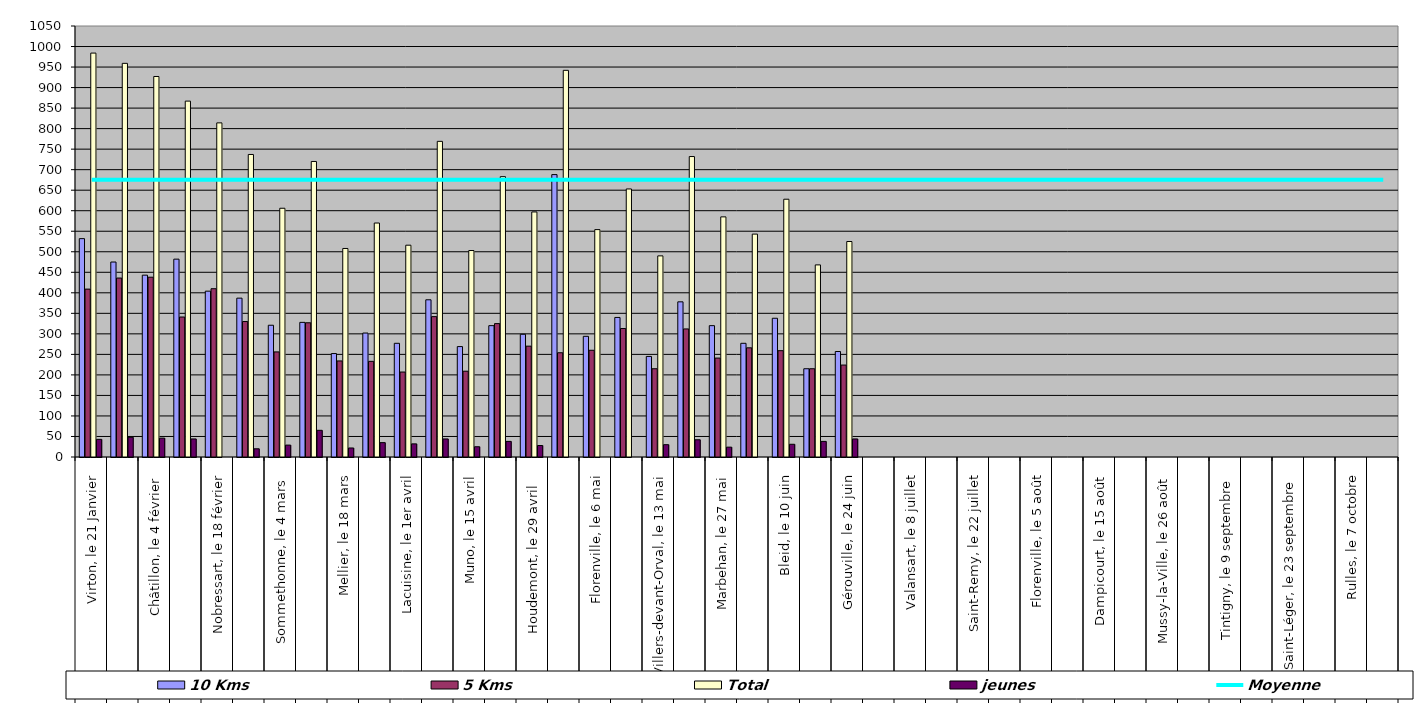
| Category | 10 Kms | 5 Kms | Total | jeunes |
|---|---|---|---|---|
| 0 | 532 | 409 | 984 | 43 |
| 1 | 475 | 436 | 959 | 48 |
| 2 | 443 | 438 | 927 | 46 |
| 3 | 482 | 341 | 867 | 44 |
| 4 | 404 | 410 | 814 | 0 |
| 5 | 387 | 330 | 737 | 20 |
| 6 | 321 | 256 | 606 | 29 |
| 7 | 328 | 327 | 720 | 65 |
| 8 | 252 | 234 | 508 | 22 |
| 9 | 302 | 233 | 570 | 35 |
| 10 | 277 | 207 | 516 | 32 |
| 11 | 383 | 342 | 769 | 44 |
| 12 | 269 | 209 | 503 | 25 |
| 13 | 320 | 325 | 683 | 38 |
| 14 | 299 | 270 | 597 | 28 |
| 15 | 688 | 254 | 942 | 0 |
| 16 | 294 | 260 | 554 | 0 |
| 17 | 340 | 313 | 653 | 0 |
| 18 | 245 | 215 | 490 | 30 |
| 19 | 378 | 312 | 732 | 42 |
| 20 | 320 | 241 | 585 | 24 |
| 21 | 277 | 266 | 543 | 0 |
| 22 | 338 | 259 | 628 | 31 |
| 23 | 215 | 215 | 468 | 38 |
| 24 | 257 | 224 | 525 | 44 |
| 25 | 0 | 0 | 0 | 0 |
| 26 | 0 | 0 | 0 | 0 |
| 27 | 0 | 0 | 0 | 0 |
| 28 | 0 | 0 | 0 | 0 |
| 29 | 0 | 0 | 0 | 0 |
| 30 | 0 | 0 | 0 | 0 |
| 31 | 0 | 0 | 0 | 0 |
| 32 | 0 | 0 | 0 | 0 |
| 33 | 0 | 0 | 0 | 0 |
| 34 | 0 | 0 | 0 | 0 |
| 35 | 0 | 0 | 0 | 0 |
| 36 | 0 | 0 | 0 | 0 |
| 37 | 0 | 0 | 0 | 0 |
| 38 | 0 | 0 | 0 | 0 |
| 39 | 0 | 0 | 0 | 0 |
| 40 | 0 | 0 | 0 | 0 |
| 41 | 0 | 0 | 0 | 0 |